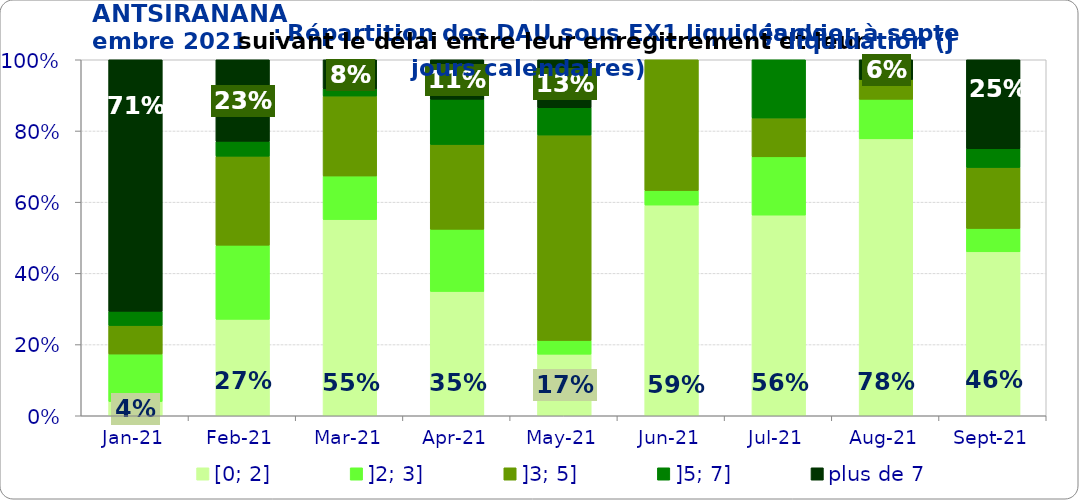
| Category | [0; 2] | ]2; 3] | ]3; 5] | ]5; 7] | plus de 7 |
|---|---|---|---|---|---|
| 2021-01-01 | 0.04 | 0.133 | 0.08 | 0.04 | 0.707 |
| 2021-02-01 | 0.271 | 0.208 | 0.25 | 0.042 | 0.229 |
| 2021-03-01 | 0.551 | 0.122 | 0.224 | 0.02 | 0.082 |
| 2021-04-01 | 0.349 | 0.175 | 0.238 | 0.127 | 0.111 |
| 2021-05-01 | 0.173 | 0.038 | 0.577 | 0.077 | 0.135 |
| 2021-06-01 | 0.592 | 0.041 | 0.367 | 0 | 0 |
| 2021-07-01 | 0.564 | 0.164 | 0.109 | 0.164 | 0 |
| 2021-08-01 | 0.778 | 0.111 | 0.056 | 0 | 0.056 |
| 2021-09-01 | 0.461 | 0.066 | 0.171 | 0.053 | 0.25 |